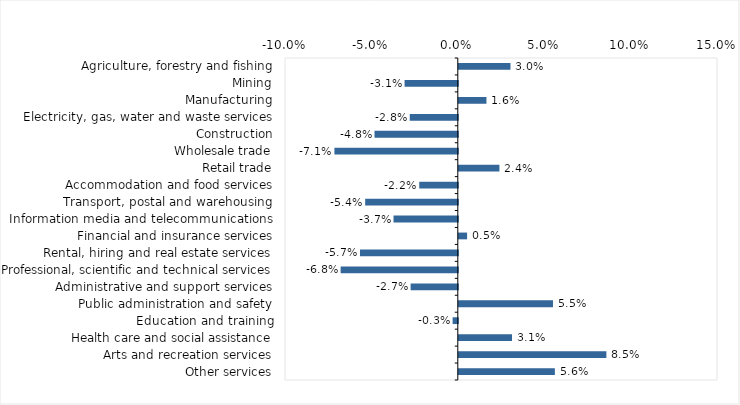
| Category | This week |
|---|---|
| Agriculture, forestry and fishing | 0.03 |
| Mining | -0.031 |
| Manufacturing | 0.016 |
| Electricity, gas, water and waste services | -0.028 |
| Construction | -0.048 |
| Wholesale trade | -0.071 |
| Retail trade | 0.024 |
| Accommodation and food services | -0.022 |
| Transport, postal and warehousing | -0.054 |
| Information media and telecommunications | -0.037 |
| Financial and insurance services | 0.005 |
| Rental, hiring and real estate services | -0.057 |
| Professional, scientific and technical services | -0.068 |
| Administrative and support services | -0.027 |
| Public administration and safety | 0.054 |
| Education and training | -0.003 |
| Health care and social assistance | 0.031 |
| Arts and recreation services | 0.085 |
| Other services | 0.056 |